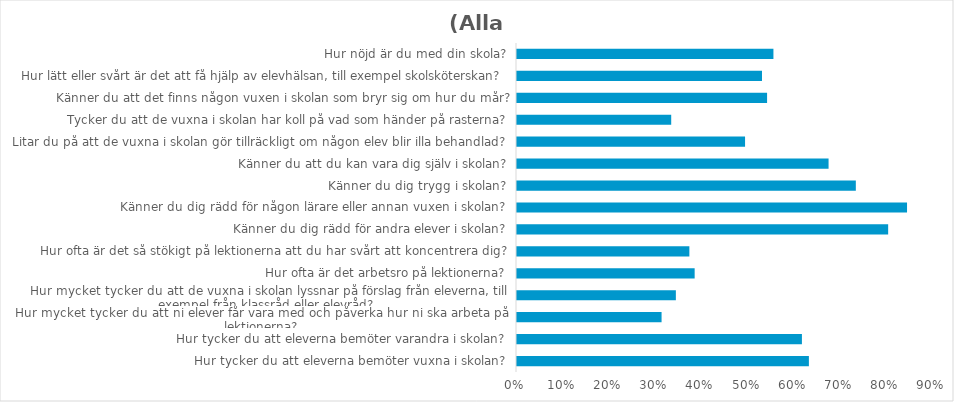
| Category | (Alla) |
|---|---|
| Hur tycker du att eleverna bemöter vuxna i skolan? | 0.631 |
| Hur tycker du att eleverna bemöter varandra i skolan? | 0.616 |
| Hur mycket tycker du att ni elever får vara med och påverka hur ni ska arbeta på lektionerna? | 0.313 |
| Hur mycket tycker du att de vuxna i skolan lyssnar på förslag från eleverna, till exempel från klassråd eller elevråd? | 0.344 |
| Hur ofta är det arbetsro på lektionerna? | 0.384 |
| Hur ofta är det så stökigt på lektionerna att du har svårt att koncentrera dig? | 0.373 |
| Känner du dig rädd för andra elever i skolan? | 0.803 |
| Känner du dig rädd för någon lärare eller annan vuxen i skolan? | 0.844 |
| Känner du dig trygg i skolan? | 0.733 |
| Känner du att du kan vara dig själv i skolan? | 0.674 |
| Litar du på att de vuxna i skolan gör tillräckligt om någon elev blir illa behandlad? | 0.493 |
| Tycker du att de vuxna i skolan har koll på vad som händer på rasterna? | 0.334 |
| Känner du att det finns någon vuxen i skolan som bryr sig om hur du mår? | 0.541 |
| Hur lätt eller svårt är det att få hjälp av elevhälsan, till exempel skolsköterskan? | 0.53 |
| Hur nöjd är du med din skola? | 0.555 |